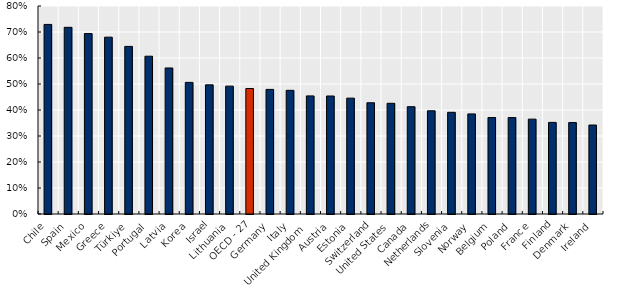
| Category | Series 0 |
|---|---|
| Chile | 0.729 |
| Spain | 0.718 |
| Mexico | 0.694 |
| Greece | 0.68 |
| Türkiye | 0.645 |
| Portugal | 0.607 |
| Latvia | 0.562 |
| Korea | 0.506 |
| Israel | 0.497 |
| Lithuania | 0.492 |
| OECD - 27 | 0.483 |
| Germany | 0.479 |
| Italy | 0.476 |
| United Kingdom  | 0.454 |
| Austria | 0.454 |
| Estonia | 0.446 |
| Switzerland | 0.428 |
| United States | 0.426 |
| Canada | 0.413 |
| Netherlands | 0.397 |
| Slovenia | 0.391 |
| Norway | 0.385 |
| Belgium | 0.371 |
| Poland | 0.371 |
| France | 0.365 |
| Finland | 0.352 |
| Denmark | 0.352 |
| Ireland | 0.342 |